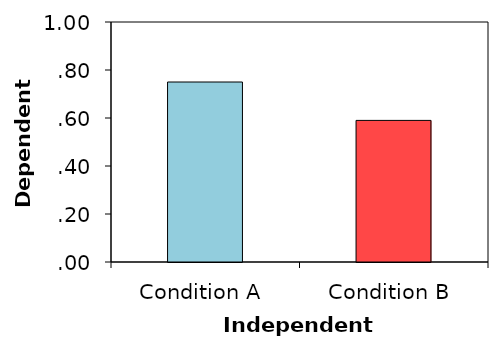
| Category | DV mean |
|---|---|
| Condition A | 0.75 |
| Condition B | 0.59 |